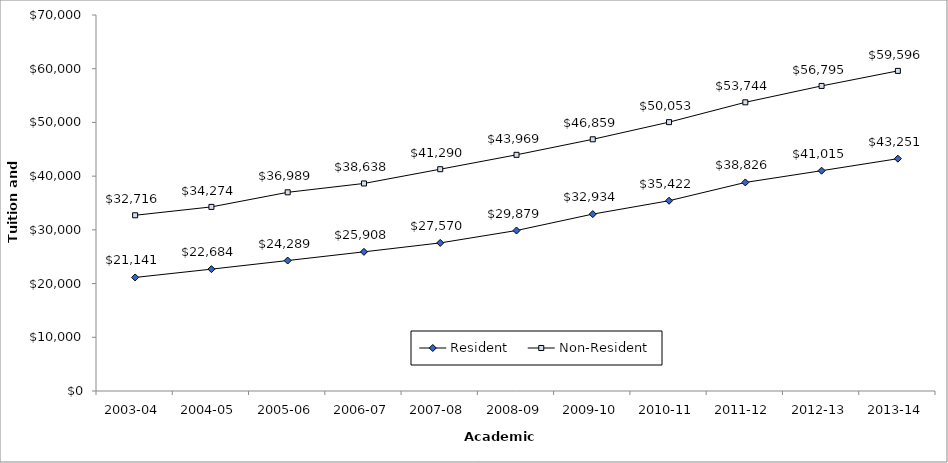
| Category | Resident | Non-Resident |
|---|---|---|
| 2003-04 | 21141 | 32716 |
| 2004-05 | 22684 | 34274 |
| 2005-06 | 24289 | 36989 |
| 2006-07 | 25908 | 38638 |
| 2007-08 | 27570 | 41290 |
| 2008-09 | 29879 | 43969 |
| 2009-10 | 32934 | 46859 |
| 2010-11 | 35422 | 50053 |
| 2011-12 | 38826 | 53744 |
| 2012-13 | 41015 | 56795 |
| 2013-14 | 43251 | 59596 |